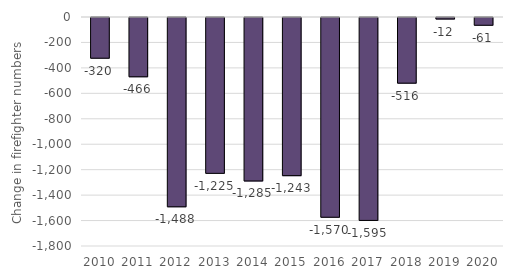
| Category | Firefighters |
|---|---|
| 2010 | -320 |
| 2011 | -466 |
| 2012 | -1488 |
| 2013 | -1225 |
| 2014 | -1285 |
| 2015 | -1243 |
| 2016 | -1570 |
| 2017 | -1595 |
| 2018 | -516 |
| 2019 | -12 |
| 2020 | -61 |